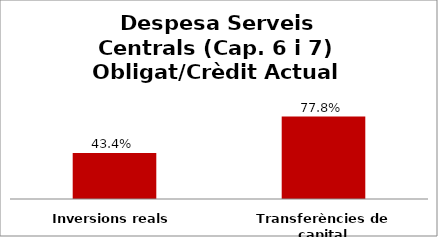
| Category | Series 0 |
|---|---|
| Inversions reals | 0.434 |
| Transferències de capital | 0.778 |